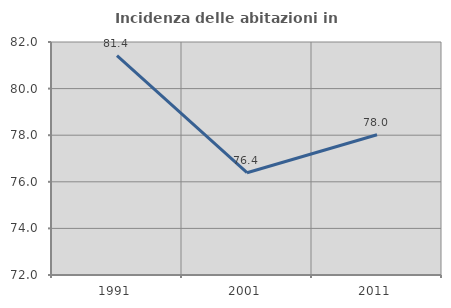
| Category | Incidenza delle abitazioni in proprietà  |
|---|---|
| 1991.0 | 81.411 |
| 2001.0 | 76.39 |
| 2011.0 | 78.02 |